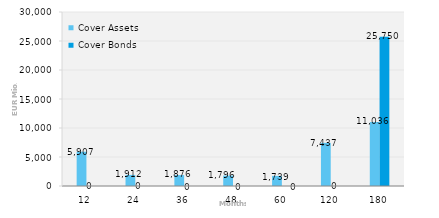
| Category | Cover Assets | Cover Bonds |
|---|---|---|
| 12.0 | 5907.432 | 0 |
| 24.0 | 1912.362 | 0 |
| 36.0 | 1876 | 0 |
| 48.0 | 1795.727 | 0 |
| 60.0 | 1738.814 | 0 |
| 120.0 | 7437.059 | 0 |
| 180.0 | 11035.532 | 25750 |